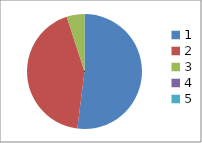
| Category | Series 0 |
|---|---|
| 0 | 0.52 |
| 1 | 0.43 |
| 2 | 0.05 |
| 3 | 0 |
| 4 | 0 |